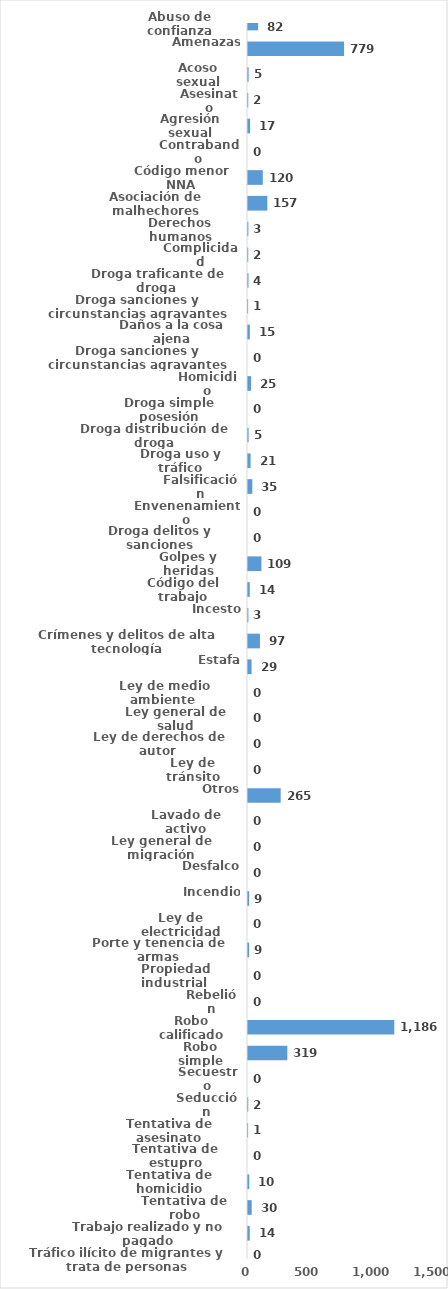
| Category | Series 0 |
|---|---|
| Abuso de confianza | 82 |
| Amenazas | 779 |
| Acoso sexual | 5 |
| Asesinato | 2 |
| Agresión sexual | 17 |
| Contrabando | 0 |
| Código menor NNA | 120 |
| Asociación de malhechores | 157 |
| Derechos humanos | 3 |
| Complicidad | 2 |
| Droga traficante de droga  | 4 |
| Droga sanciones y circunstancias agravantes | 1 |
| Daños a la cosa ajena | 15 |
| Droga sanciones y circunstancias agravantes | 0 |
| Homicidio | 25 |
| Droga simple posesión | 0 |
| Droga distribución de droga | 5 |
| Droga uso y tráfico | 21 |
| Falsificación | 35 |
| Envenenamiento | 0 |
| Droga delitos y sanciones | 0 |
| Golpes y heridas | 109 |
| Código del trabajo | 14 |
| Incesto | 3 |
| Crímenes y delitos de alta tecnología | 97 |
| Estafa | 29 |
| Ley de medio ambiente  | 0 |
| Ley general de salud | 0 |
| Ley de derechos de autor  | 0 |
| Ley de tránsito | 0 |
| Otros | 265 |
| Lavado de activo | 0 |
| Ley general de migración | 0 |
| Desfalco | 0 |
| Incendio | 9 |
| Ley de electricidad | 0 |
| Porte y tenencia de armas | 9 |
| Propiedad industrial  | 0 |
| Rebelión | 0 |
| Robo calificado | 1186 |
| Robo simple | 319 |
| Secuestro | 0 |
| Seducción | 2 |
| Tentativa de asesinato | 1 |
| Tentativa de estupro | 0 |
| Tentativa de homicidio | 10 |
| Tentativa de robo | 30 |
| Trabajo realizado y no pagado | 14 |
| Tráfico ilícito de migrantes y trata de personas | 0 |